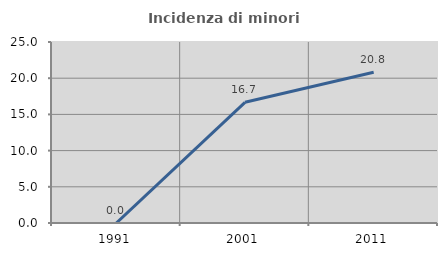
| Category | Incidenza di minori stranieri |
|---|---|
| 1991.0 | 0 |
| 2001.0 | 16.667 |
| 2011.0 | 20.833 |